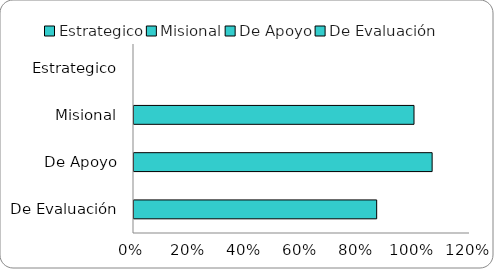
| Category | Series 0 |
|---|---|
| Estrategico | 0 |
| Misional | 1 |
| De Apoyo | 1.065 |
| De Evaluación | 0.867 |